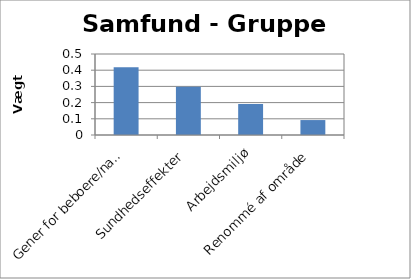
| Category | Vægt 2 |
|---|---|
| Gener for beboere/naboer | 0.418 |
| Sundhedseffekter | 0.299 |
| Arbejdsmiljø | 0.191 |
| Renommé af område | 0.092 |